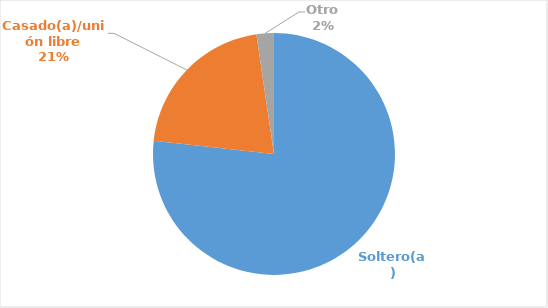
| Category | Series 0 |
|---|---|
| Soltero(a) | 0.767 |
| Casado(a)/unión libre | 0.209 |
| Otro | 0.023 |